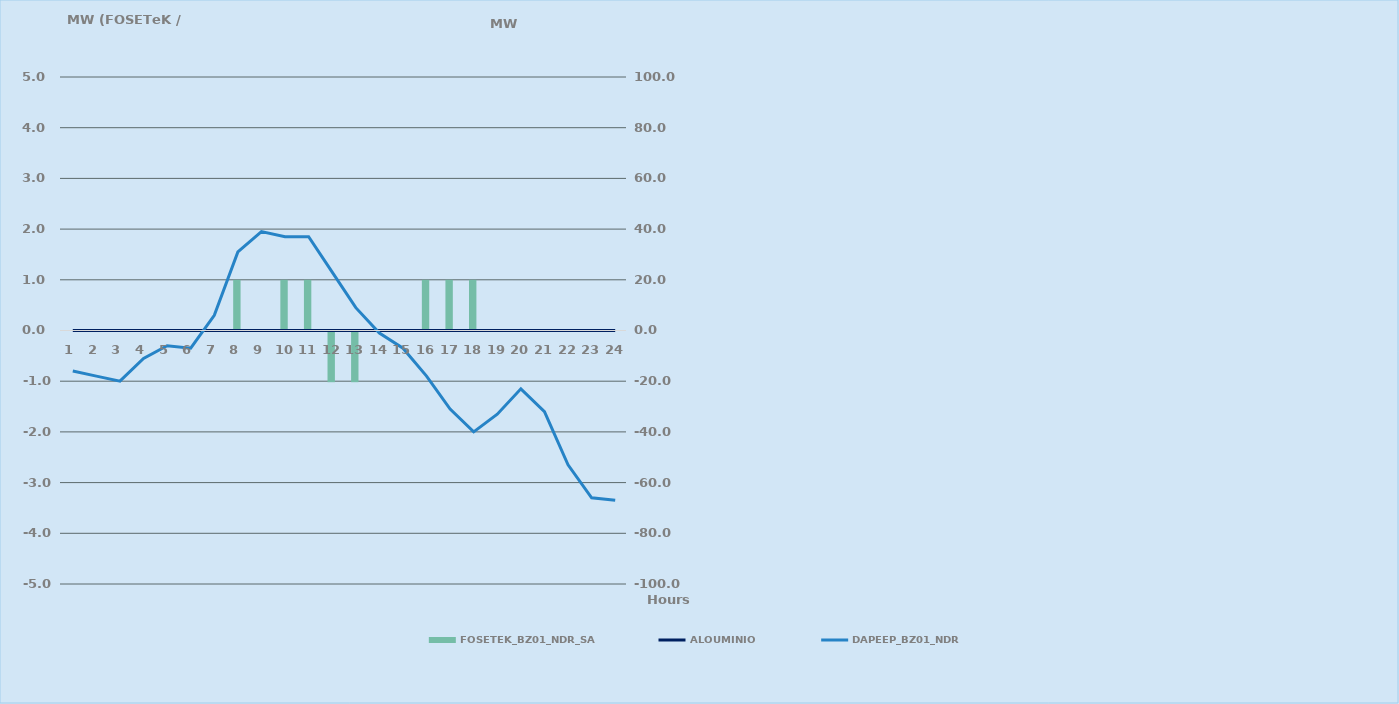
| Category | FOSETEK_BZ01_NDR_SA |
|---|---|
| 0 | 0 |
| 1 | 0 |
| 2 | 0 |
| 3 | 0 |
| 4 | 0 |
| 5 | 0 |
| 6 | 0 |
| 7 | 1 |
| 8 | 0 |
| 9 | 1 |
| 10 | 1 |
| 11 | -1 |
| 12 | -1 |
| 13 | 0 |
| 14 | 0 |
| 15 | 1 |
| 16 | 1 |
| 17 | 1 |
| 18 | 0 |
| 19 | 0 |
| 20 | 0 |
| 21 | 0 |
| 22 | 0 |
| 23 | 0 |